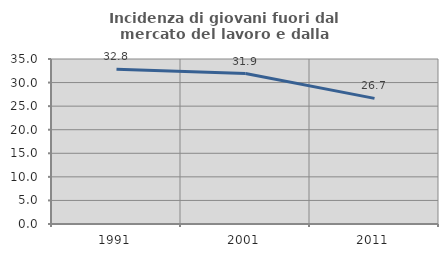
| Category | Incidenza di giovani fuori dal mercato del lavoro e dalla formazione  |
|---|---|
| 1991.0 | 32.821 |
| 2001.0 | 31.909 |
| 2011.0 | 26.653 |